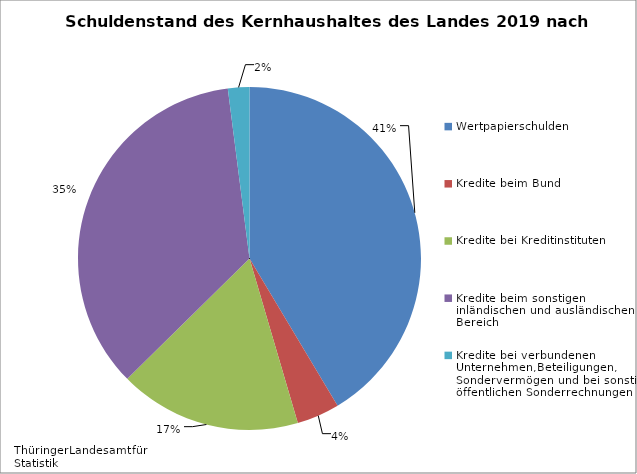
| Category | Series 0 | Wertpapierschulden |
|---|---|---|
| Wertpapierschulden | 0.41 |  |
| Kredite beim Bund | 0.04 |  |
| Kredite bei Kreditinstituten | 0.17 |  |
| Kredite beim sonstigen inländischen und ausländischen Bereich | 0.35 |  |
| Kredite bei verbundenen Unternehmen,Beteiligungen, Sondervermögen und bei sonstigen öffentlichen Sonderrechnungen | 0.02 |  |